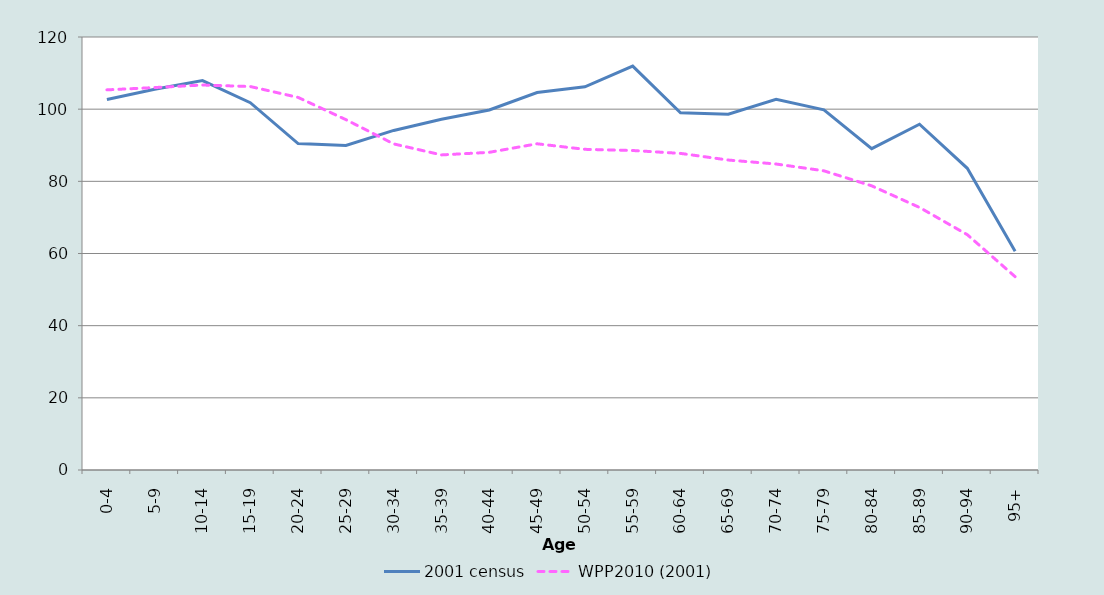
| Category | 2001 census | WPP2010 (2001) |
|---|---|---|
| 0-4 | 102.702 | 105.351 |
| 5-9 | 105.525 | 105.989 |
| 10-14 | 107.91 | 106.694 |
| 15-19 | 101.784 | 106.275 |
| 20-24 | 90.478 | 103.255 |
| 25-29 | 89.933 | 97.094 |
| 30-34 | 94.104 | 90.375 |
| 35-39 | 97.215 | 87.322 |
| 40-44 | 99.786 | 88.038 |
| 45-49 | 104.602 | 90.408 |
| 50-54 | 106.202 | 88.867 |
| 55-59 | 111.927 | 88.545 |
| 60-64 | 98.983 | 87.745 |
| 65-69 | 98.613 | 85.899 |
| 70-74 | 102.711 | 84.802 |
| 75-79 | 99.805 | 82.915 |
| 80-84 | 89.072 | 78.752 |
| 85-89 | 95.817 | 72.767 |
| 90-94 | 83.607 | 65.216 |
| 95+ | 60.598 | 53.581 |